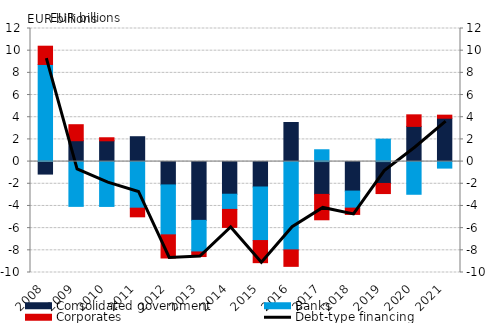
| Category | Consolidated government | Banks | Corporates |
|---|---|---|---|
| 2008.0 | -1.125 | 8.757 | 1.647 |
| 2009.0 | 1.882 | -4.038 | 1.444 |
| 2010.0 | 1.875 | -4.043 | 0.274 |
| 2011.0 | 2.243 | -4.2 | -0.78 |
| 2012.0 | -2.104 | -4.501 | -2.087 |
| 2013.0 | -5.3 | -2.846 | -0.416 |
| 2014.0 | -2.942 | -1.37 | -1.625 |
| 2015.0 | -2.287 | -4.833 | -1.993 |
| 2016.0 | 3.526 | -7.961 | -1.485 |
| 2017.0 | -2.959 | 1.067 | -2.287 |
| 2018.0 | -2.659 | -1.537 | -0.567 |
| 2019.0 | -1.972 | 2.023 | -0.911 |
| 2020.0 | 3.174 | -2.947 | 1.043 |
| 2021.0 | 3.911 | -0.587 | 0.275 |